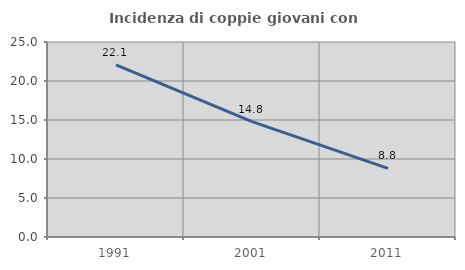
| Category | Incidenza di coppie giovani con figli |
|---|---|
| 1991.0 | 22.069 |
| 2001.0 | 14.782 |
| 2011.0 | 8.8 |